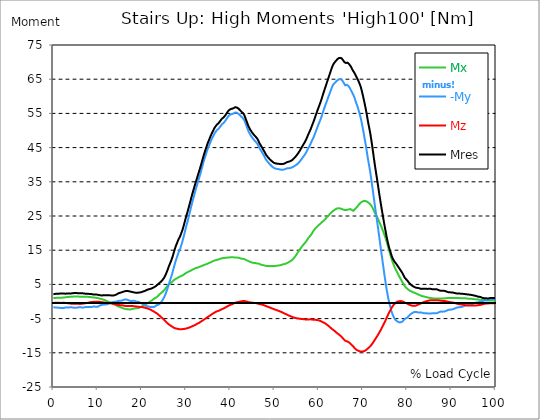
| Category |  Mx |  -My |  Mz |  Mres |
|---|---|---|---|---|
| 0.0 | 1.007 | -1.636 | -0.413 | 2.121 |
| 0.16678370786516855 | 1.007 | -1.672 | -0.413 | 2.175 |
| 0.3335674157303371 | 1.025 | -1.726 | -0.395 | 2.211 |
| 0.5003511235955057 | 1.043 | -1.744 | -0.378 | 2.247 |
| 0.6671348314606742 | 1.061 | -1.78 | -0.378 | 2.265 |
| 0.8339185393258427 | 1.079 | -1.798 | -0.378 | 2.283 |
| 1.0007022471910114 | 1.097 | -1.798 | -0.378 | 2.283 |
| 1.1674859550561796 | 1.115 | -1.798 | -0.395 | 2.301 |
| 1.3342696629213484 | 1.115 | -1.834 | -0.395 | 2.301 |
| 1.5010533707865168 | 1.115 | -1.87 | -0.413 | 2.337 |
| 1.6678370786516854 | 1.115 | -1.888 | -0.413 | 2.355 |
| 1.8346207865168538 | 1.115 | -1.923 | -0.413 | 2.373 |
| 2.001404494382023 | 1.133 | -1.923 | -0.395 | 2.373 |
| 2.1681882022471908 | 1.133 | -1.923 | -0.378 | 2.373 |
| 2.334971910112359 | 1.15 | -1.905 | -0.378 | 2.355 |
| 2.501755617977528 | 1.186 | -1.852 | -0.395 | 2.319 |
| 2.668539325842697 | 1.222 | -1.78 | -0.413 | 2.283 |
| 2.8353230337078656 | 1.24 | -1.744 | -0.449 | 2.283 |
| 3.0021067415730336 | 1.276 | -1.78 | -0.467 | 2.319 |
| 3.168890449438202 | 1.294 | -1.798 | -0.485 | 2.355 |
| 3.335674157303371 | 1.312 | -1.78 | -0.503 | 2.355 |
| 3.502457865168539 | 1.348 | -1.744 | -0.521 | 2.355 |
| 3.6692415730337076 | 1.366 | -1.726 | -0.557 | 2.355 |
| 3.8360252808988764 | 1.384 | -1.69 | -0.593 | 2.337 |
| 4.002808988764046 | 1.402 | -1.672 | -0.629 | 2.355 |
| 4.169592696629214 | 1.42 | -1.69 | -0.647 | 2.373 |
| 4.3363764044943816 | 1.42 | -1.744 | -0.647 | 2.409 |
| 4.50316011235955 | 1.438 | -1.798 | -0.647 | 2.445 |
| 4.669943820224718 | 1.438 | -1.834 | -0.647 | 2.463 |
| 4.836727528089888 | 1.42 | -1.852 | -0.647 | 2.481 |
| 5.003511235955056 | 1.438 | -1.852 | -0.629 | 2.481 |
| 5.170294943820225 | 1.456 | -1.834 | -0.629 | 2.481 |
| 5.337078651685394 | 1.456 | -1.798 | -0.647 | 2.463 |
| 5.5038623595505625 | 1.456 | -1.744 | -0.665 | 2.427 |
| 5.670646067415731 | 1.438 | -1.69 | -0.683 | 2.409 |
| 5.837429775280899 | 1.42 | -1.672 | -0.701 | 2.391 |
| 6.004213483146067 | 1.402 | -1.672 | -0.701 | 2.391 |
| 6.170997191011236 | 1.402 | -1.708 | -0.701 | 2.409 |
| 6.329002808988764 | 1.384 | -1.726 | -0.683 | 2.409 |
| 6.495786516853932 | 1.384 | -1.744 | -0.665 | 2.409 |
| 6.662570224719101 | 1.384 | -1.744 | -0.629 | 2.391 |
| 6.82935393258427 | 1.366 | -1.726 | -0.593 | 2.373 |
| 6.9961376404494375 | 1.366 | -1.708 | -0.557 | 2.337 |
| 7.162921348314607 | 1.366 | -1.654 | -0.521 | 2.301 |
| 7.329705056179775 | 1.384 | -1.618 | -0.503 | 2.265 |
| 7.496488764044945 | 1.384 | -1.6 | -0.467 | 2.265 |
| 7.663272471910113 | 1.384 | -1.618 | -0.413 | 2.265 |
| 7.830056179775281 | 1.366 | -1.618 | -0.378 | 2.247 |
| 7.996839887640449 | 1.33 | -1.618 | -0.324 | 2.229 |
| 8.16362359550562 | 1.312 | -1.618 | -0.252 | 2.193 |
| 8.330407303370787 | 1.294 | -1.636 | -0.198 | 2.175 |
| 8.497191011235955 | 1.276 | -1.636 | -0.162 | 2.175 |
| 8.663974719101123 | 1.24 | -1.618 | -0.126 | 2.157 |
| 8.830758426966291 | 1.222 | -1.528 | -0.126 | 2.121 |
| 8.99754213483146 | 1.186 | -1.492 | -0.108 | 2.067 |
| 9.16432584269663 | 1.168 | -1.474 | -0.108 | 2.049 |
| 9.331109550561798 | 1.15 | -1.492 | -0.108 | 2.049 |
| 9.497893258426966 | 1.115 | -1.528 | -0.108 | 2.049 |
| 9.664676966292134 | 1.061 | -1.528 | -0.09 | 2.031 |
| 9.831460674157304 | 1.025 | -1.528 | -0.09 | 2.031 |
| 9.998244382022472 | 0.989 | -1.51 | -0.072 | 1.995 |
| 10.16502808988764 | 0.935 | -1.402 | -0.072 | 1.941 |
| 10.331811797752808 | 0.899 | -1.294 | -0.09 | 1.888 |
| 10.498595505617978 | 0.845 | -1.186 | -0.108 | 1.852 |
| 10.665379213483147 | 0.791 | -1.097 | -0.126 | 1.816 |
| 10.832162921348315 | 0.719 | -1.025 | -0.162 | 1.78 |
| 10.998946629213483 | 0.665 | -0.971 | -0.198 | 1.762 |
| 11.165730337078653 | 0.593 | -0.917 | -0.234 | 1.798 |
| 11.33251404494382 | 0.521 | -0.899 | -0.27 | 1.834 |
| 11.49929775280899 | 0.431 | -0.881 | -0.306 | 1.852 |
| 11.666081460674157 | 0.378 | -0.863 | -0.342 | 1.816 |
| 11.832865168539326 | 0.27 | -0.863 | -0.36 | 1.816 |
| 11.999648876404493 | 0.18 | -0.845 | -0.395 | 1.834 |
| 12.166432584269662 | 0.072 | -0.809 | -0.413 | 1.834 |
| 12.333216292134832 | -0.018 | -0.737 | -0.431 | 1.816 |
| 12.5 | -0.09 | -0.629 | -0.449 | 1.798 |
| 12.66678370786517 | -0.18 | -0.521 | -0.467 | 1.816 |
| 12.833567415730336 | -0.252 | -0.395 | -0.503 | 1.834 |
| 13.000351123595506 | -0.342 | -0.306 | -0.557 | 1.78 |
| 13.167134831460674 | -0.395 | -0.252 | -0.593 | 1.744 |
| 13.333918539325843 | -0.503 | -0.198 | -0.629 | 1.762 |
| 13.500702247191011 | -0.611 | -0.18 | -0.665 | 1.762 |
| 13.667485955056181 | -0.737 | -0.126 | -0.719 | 1.78 |
| 13.834269662921349 | -0.863 | -0.09 | -0.773 | 1.798 |
| 14.001053370786519 | -0.971 | -0.09 | -0.827 | 1.888 |
| 14.167837078651687 | -1.097 | -0.054 | -0.863 | 1.995 |
| 14.334620786516853 | -1.204 | -0.018 | -0.917 | 2.103 |
| 14.501404494382026 | -1.312 | 0.054 | -0.953 | 2.229 |
| 14.668188202247192 | -1.42 | 0.162 | -1.007 | 2.373 |
| 14.834971910112362 | -1.492 | 0.198 | -1.043 | 2.445 |
| 15.001755617977528 | -1.582 | 0.198 | -1.061 | 2.517 |
| 15.168539325842698 | -1.654 | 0.216 | -1.079 | 2.571 |
| 15.335323033707864 | -1.762 | 0.234 | -1.079 | 2.643 |
| 15.502106741573034 | -1.852 | 0.288 | -1.097 | 2.714 |
| 15.6688904494382 | -1.923 | 0.36 | -1.133 | 2.786 |
| 15.83567415730337 | -2.013 | 0.467 | -1.186 | 2.876 |
| 16.00245786516854 | -2.085 | 0.539 | -1.222 | 2.948 |
| 16.16924157303371 | -2.139 | 0.593 | -1.258 | 3.02 |
| 16.336025280898877 | -2.175 | 0.593 | -1.294 | 3.056 |
| 16.502808988764045 | -2.247 | 0.593 | -1.312 | 3.11 |
| 16.669592696629216 | -2.283 | 0.539 | -1.33 | 3.11 |
| 16.83637640449438 | -2.301 | 0.449 | -1.348 | 3.074 |
| 17.003160112359552 | -2.301 | 0.36 | -1.348 | 3.02 |
| 17.169943820224717 | -2.301 | 0.27 | -1.348 | 2.966 |
| 17.336727528089888 | -2.319 | 0.198 | -1.348 | 2.93 |
| 17.503511235955056 | -2.301 | 0.198 | -1.348 | 2.894 |
| 17.670294943820224 | -2.247 | 0.126 | -1.33 | 2.822 |
| 17.837078651685395 | -2.193 | 0.162 | -1.33 | 2.768 |
| 18.003862359550563 | -2.121 | 0.198 | -1.348 | 2.714 |
| 18.17064606741573 | -2.085 | 0.216 | -1.366 | 2.66 |
| 18.3374297752809 | -2.049 | 0.18 | -1.384 | 2.625 |
| 18.504213483146067 | -1.995 | 0.108 | -1.42 | 2.571 |
| 18.662219101123597 | -1.977 | 0.018 | -1.456 | 2.571 |
| 18.829002808988765 | -1.959 | -0.036 | -1.492 | 2.571 |
| 18.995786516853933 | -1.923 | -0.09 | -1.51 | 2.571 |
| 19.1625702247191 | -1.923 | -0.072 | -1.546 | 2.607 |
| 19.32935393258427 | -1.87 | -0.108 | -1.564 | 2.607 |
| 19.49613764044944 | -1.762 | -0.234 | -1.564 | 2.607 |
| 19.662921348314608 | -1.672 | -0.378 | -1.582 | 2.66 |
| 19.829705056179776 | -1.564 | -0.449 | -1.618 | 2.714 |
| 19.996488764044944 | -1.456 | -0.575 | -1.636 | 2.786 |
| 20.163272471910112 | -1.348 | -0.701 | -1.672 | 2.876 |
| 20.33005617977528 | -1.222 | -0.827 | -1.708 | 2.948 |
| 20.49683988764045 | -1.079 | -0.971 | -1.762 | 3.002 |
| 20.663623595505616 | -0.917 | -1.133 | -1.816 | 3.074 |
| 20.830407303370787 | -0.773 | -1.204 | -1.87 | 3.164 |
| 20.997191011235955 | -0.683 | -1.294 | -1.923 | 3.29 |
| 21.163974719101123 | -0.575 | -1.366 | -1.977 | 3.398 |
| 21.330758426966295 | -0.467 | -1.438 | -2.049 | 3.505 |
| 21.497542134831463 | -0.324 | -1.492 | -2.121 | 3.559 |
| 21.66432584269663 | -0.198 | -1.51 | -2.211 | 3.595 |
| 21.8311095505618 | -0.072 | -1.528 | -2.301 | 3.631 |
| 21.997893258426966 | 0.108 | -1.618 | -2.409 | 3.703 |
| 22.164676966292134 | 0.234 | -1.582 | -2.517 | 3.775 |
| 22.331460674157306 | 0.36 | -1.564 | -2.643 | 3.883 |
| 22.498244382022467 | 0.557 | -1.618 | -2.75 | 4.009 |
| 22.66502808988764 | 0.737 | -1.654 | -2.894 | 4.117 |
| 22.831811797752806 | 0.863 | -1.582 | -3.038 | 4.224 |
| 22.99859550561798 | 0.989 | -1.438 | -3.164 | 4.35 |
| 23.165379213483146 | 1.097 | -1.258 | -3.29 | 4.476 |
| 23.332162921348313 | 1.24 | -1.079 | -3.415 | 4.674 |
| 23.49894662921348 | 1.42 | -0.989 | -3.577 | 4.872 |
| 23.665730337078653 | 1.636 | -0.971 | -3.757 | 5.069 |
| 23.83251404494382 | 1.87 | -0.917 | -3.937 | 5.267 |
| 23.999297752808985 | 2.085 | -0.737 | -4.135 | 5.429 |
| 24.166081460674157 | 2.265 | -0.503 | -4.332 | 5.609 |
| 24.332865168539325 | 2.445 | -0.252 | -4.53 | 5.806 |
| 24.499648876404496 | 2.607 | 0.036 | -4.71 | 6.022 |
| 24.666432584269664 | 2.804 | 0.36 | -4.908 | 6.274 |
| 24.833216292134832 | 3.002 | 0.737 | -5.123 | 6.561 |
| 25.0 | 3.218 | 1.115 | -5.321 | 6.867 |
| 25.16678370786517 | 3.451 | 1.564 | -5.537 | 7.226 |
| 25.33356741573034 | 3.739 | 2.085 | -5.752 | 7.694 |
| 25.500351123595504 | 4.045 | 2.66 | -5.968 | 8.179 |
| 25.66713483146067 | 4.35 | 3.272 | -6.202 | 8.718 |
| 25.833918539325843 | 4.602 | 3.883 | -6.382 | 9.258 |
| 26.00070224719101 | 4.89 | 4.602 | -6.579 | 9.887 |
| 26.16748595505618 | 5.123 | 5.267 | -6.741 | 10.444 |
| 26.334269662921347 | 5.267 | 5.968 | -6.903 | 10.983 |
| 26.50105337078652 | 5.375 | 6.615 | -7.047 | 11.487 |
| 26.667837078651687 | 5.519 | 7.262 | -7.191 | 12.026 |
| 26.834620786516858 | 5.716 | 7.999 | -7.334 | 12.637 |
| 27.001404494382022 | 5.914 | 8.772 | -7.478 | 13.302 |
| 27.16818820224719 | 6.13 | 9.581 | -7.622 | 14.057 |
| 27.334971910112362 | 6.328 | 10.39 | -7.73 | 14.776 |
| 27.50175561797753 | 6.471 | 11.181 | -7.82 | 15.478 |
| 27.668539325842698 | 6.615 | 11.9 | -7.874 | 16.125 |
| 27.835323033707866 | 6.741 | 12.529 | -7.928 | 16.682 |
| 28.002106741573037 | 6.849 | 13.159 | -7.963 | 17.203 |
| 28.168890449438205 | 6.975 | 13.824 | -8.017 | 17.779 |
| 28.335674157303373 | 7.101 | 14.417 | -8.071 | 18.282 |
| 28.502457865168537 | 7.191 | 14.902 | -8.107 | 18.677 |
| 28.669241573033705 | 7.316 | 15.406 | -8.143 | 19.109 |
| 28.836025280898877 | 7.424 | 16.035 | -8.161 | 19.648 |
| 29.002808988764052 | 7.514 | 16.772 | -8.125 | 20.241 |
| 29.169592696629213 | 7.586 | 17.491 | -8.089 | 20.817 |
| 29.336376404494384 | 7.712 | 18.318 | -8.035 | 21.554 |
| 29.50316011235955 | 7.856 | 19.163 | -7.999 | 22.309 |
| 29.669943820224724 | 8.035 | 20.026 | -7.999 | 23.117 |
| 29.836727528089884 | 8.197 | 20.906 | -7.946 | 23.944 |
| 30.003511235955056 | 8.323 | 21.769 | -7.91 | 24.735 |
| 30.170294943820224 | 8.449 | 22.596 | -7.874 | 25.49 |
| 30.337078651685395 | 8.575 | 23.387 | -7.784 | 26.209 |
| 30.503862359550563 | 8.701 | 24.232 | -7.712 | 27 |
| 30.670646067415728 | 8.79 | 25.113 | -7.64 | 27.791 |
| 30.837429775280903 | 8.88 | 25.994 | -7.55 | 28.6 |
| 30.99543539325843 | 8.988 | 26.857 | -7.46 | 29.409 |
| 31.162219101123597 | 9.114 | 27.737 | -7.388 | 30.236 |
| 31.32900280898876 | 9.222 | 28.6 | -7.298 | 31.045 |
| 31.495786516853936 | 9.33 | 29.463 | -7.208 | 31.818 |
| 31.6625702247191 | 9.456 | 30.254 | -7.083 | 32.573 |
| 31.82935393258427 | 9.581 | 31.027 | -6.975 | 33.31 |
| 31.996137640449433 | 9.671 | 31.818 | -6.885 | 34.047 |
| 32.162921348314605 | 9.743 | 32.627 | -6.759 | 34.802 |
| 32.329705056179776 | 9.797 | 33.382 | -6.651 | 35.503 |
| 32.49648876404494 | 9.851 | 34.101 | -6.543 | 36.15 |
| 32.66327247191011 | 9.941 | 34.91 | -6.418 | 36.905 |
| 32.83005617977528 | 10.049 | 35.593 | -6.328 | 37.57 |
| 32.996839887640455 | 10.121 | 36.294 | -6.202 | 38.253 |
| 33.16362359550562 | 10.193 | 37.031 | -6.058 | 38.955 |
| 33.330407303370784 | 10.282 | 37.822 | -5.896 | 39.71 |
| 33.497191011235955 | 10.372 | 38.577 | -5.752 | 40.429 |
| 33.66397471910113 | 10.462 | 39.386 | -5.627 | 41.202 |
| 33.83075842696629 | 10.552 | 40.231 | -5.483 | 42.011 |
| 33.997542134831455 | 10.642 | 41.004 | -5.339 | 42.748 |
| 34.164325842696634 | 10.732 | 41.705 | -5.195 | 43.431 |
| 34.3311095505618 | 10.804 | 42.388 | -5.051 | 44.096 |
| 34.49789325842697 | 10.894 | 43.035 | -4.89 | 44.725 |
| 34.66467696629213 | 10.966 | 43.718 | -4.746 | 45.39 |
| 34.831460674157306 | 11.055 | 44.383 | -4.602 | 46.037 |
| 34.99824438202247 | 11.145 | 44.977 | -4.458 | 46.63 |
| 35.16502808988764 | 11.253 | 45.498 | -4.314 | 47.134 |
| 35.331811797752806 | 11.343 | 46.037 | -4.17 | 47.673 |
| 35.49859550561798 | 11.415 | 46.576 | -4.027 | 48.194 |
| 35.66537921348315 | 11.505 | 47.062 | -3.883 | 48.698 |
| 35.83216292134831 | 11.631 | 47.565 | -3.739 | 49.183 |
| 35.998946629213485 | 11.738 | 48.015 | -3.595 | 49.632 |
| 36.16573033707865 | 11.846 | 48.428 | -3.469 | 50.064 |
| 36.33251404494382 | 11.936 | 48.877 | -3.326 | 50.513 |
| 36.499297752808985 | 12.008 | 49.255 | -3.2 | 50.873 |
| 36.666081460674164 | 12.08 | 49.561 | -3.056 | 51.178 |
| 36.83286516853932 | 12.134 | 49.848 | -2.948 | 51.466 |
| 36.99964887640449 | 12.188 | 50.136 | -2.876 | 51.772 |
| 37.166432584269664 | 12.242 | 50.316 | -2.804 | 51.951 |
| 37.333216292134836 | 12.296 | 50.477 | -2.732 | 52.113 |
| 37.5 | 12.386 | 50.675 | -2.643 | 52.329 |
| 37.666783707865164 | 12.476 | 51.017 | -2.517 | 52.67 |
| 37.833567415730336 | 12.547 | 51.322 | -2.409 | 52.976 |
| 38.00035112359551 | 12.601 | 51.538 | -2.319 | 53.174 |
| 38.16713483146068 | 12.637 | 51.879 | -2.211 | 53.515 |
| 38.333918539325836 | 12.673 | 52.059 | -2.121 | 53.695 |
| 38.50070224719101 | 12.709 | 52.221 | -2.031 | 53.839 |
| 38.66748595505618 | 12.727 | 52.419 | -1.923 | 54.037 |
| 38.83426966292135 | 12.763 | 52.742 | -1.798 | 54.36 |
| 39.001053370786515 | 12.799 | 53.048 | -1.672 | 54.666 |
| 39.16783707865169 | 12.817 | 53.407 | -1.546 | 55.007 |
| 39.33462078651686 | 12.835 | 53.713 | -1.42 | 55.313 |
| 39.50140449438202 | 12.871 | 54.073 | -1.312 | 55.654 |
| 39.668188202247194 | 12.889 | 54.324 | -1.186 | 55.888 |
| 39.83497191011236 | 12.889 | 54.522 | -1.079 | 56.086 |
| 40.00175561797753 | 12.907 | 54.648 | -0.989 | 56.212 |
| 40.168539325842694 | 12.925 | 54.738 | -0.899 | 56.302 |
| 40.335323033707866 | 12.907 | 54.774 | -0.827 | 56.338 |
| 40.50210674157304 | 12.907 | 54.846 | -0.737 | 56.392 |
| 40.6688904494382 | 12.907 | 54.953 | -0.629 | 56.499 |
| 40.83567415730337 | 12.889 | 55.043 | -0.539 | 56.589 |
| 41.00245786516854 | 12.889 | 55.187 | -0.431 | 56.715 |
| 41.16924157303371 | 12.871 | 55.277 | -0.342 | 56.823 |
| 41.33602528089887 | 12.853 | 55.241 | -0.288 | 56.787 |
| 41.502808988764045 | 12.835 | 55.169 | -0.234 | 56.697 |
| 41.669592696629216 | 12.817 | 55.043 | -0.18 | 56.571 |
| 41.83637640449439 | 12.781 | 54.899 | -0.144 | 56.427 |
| 42.00316011235955 | 12.763 | 54.756 | -0.09 | 56.284 |
| 42.16994382022472 | 12.673 | 54.486 | -0.036 | 55.996 |
| 42.33672752808989 | 12.601 | 54.27 | 0.018 | 55.762 |
| 42.50351123595506 | 12.547 | 54.037 | 0.054 | 55.529 |
| 42.670294943820224 | 12.476 | 53.821 | 0.09 | 55.295 |
| 42.83707865168539 | 12.476 | 53.659 | 0.126 | 55.133 |
| 43.00386235955057 | 12.458 | 53.443 | 0.144 | 54.935 |
| 43.17064606741573 | 12.404 | 53.03 | 0.126 | 54.504 |
| 43.32865168539326 | 12.296 | 52.491 | 0.108 | 53.965 |
| 43.495435393258425 | 12.188 | 51.915 | 0.054 | 53.371 |
| 43.6622191011236 | 12.08 | 51.322 | 0 | 52.796 |
| 43.82900280898876 | 11.972 | 50.729 | -0.054 | 52.203 |
| 43.99578651685393 | 11.864 | 50.154 | -0.126 | 51.628 |
| 44.162570224719104 | 11.774 | 49.614 | -0.198 | 51.089 |
| 44.32935393258427 | 11.685 | 49.219 | -0.252 | 50.693 |
| 44.49613764044944 | 11.595 | 48.824 | -0.288 | 50.28 |
| 44.66292134831461 | 11.505 | 48.5 | -0.306 | 49.956 |
| 44.82970505617978 | 11.415 | 48.158 | -0.342 | 49.596 |
| 44.99648876404493 | 11.361 | 47.853 | -0.36 | 49.291 |
| 45.16327247191011 | 11.325 | 47.547 | -0.378 | 49.003 |
| 45.33005617977528 | 11.289 | 47.296 | -0.395 | 48.752 |
| 45.49683988764045 | 11.253 | 47.062 | -0.413 | 48.518 |
| 45.66362359550561 | 11.235 | 46.846 | -0.449 | 48.284 |
| 45.83040730337079 | 11.199 | 46.594 | -0.485 | 48.033 |
| 45.99719101123596 | 11.145 | 46.343 | -0.503 | 47.799 |
| 46.16397471910113 | 11.145 | 46.037 | -0.557 | 47.493 |
| 46.33075842696629 | 11.091 | 45.588 | -0.647 | 47.044 |
| 46.497542134831455 | 10.983 | 45.138 | -0.701 | 46.576 |
| 46.66432584269663 | 10.93 | 44.689 | -0.773 | 46.145 |
| 46.83110955056179 | 10.84 | 44.365 | -0.809 | 45.786 |
| 46.99789325842696 | 10.75 | 44.006 | -0.845 | 45.426 |
| 47.164676966292134 | 10.678 | 43.664 | -0.899 | 45.066 |
| 47.331460674157306 | 10.642 | 43.269 | -0.971 | 44.689 |
| 47.49824438202247 | 10.606 | 42.873 | -1.043 | 44.293 |
| 47.66502808988764 | 10.552 | 42.514 | -1.115 | 43.934 |
| 47.83181179775281 | 10.516 | 42.118 | -1.204 | 43.538 |
| 47.99859550561797 | 10.462 | 41.669 | -1.312 | 43.089 |
| 48.16537921348314 | 10.39 | 41.327 | -1.384 | 42.766 |
| 48.33216292134831 | 10.336 | 41.076 | -1.438 | 42.496 |
| 48.498946629213485 | 10.354 | 40.77 | -1.528 | 42.208 |
| 48.66573033707865 | 10.39 | 40.5 | -1.636 | 41.957 |
| 48.83251404494382 | 10.372 | 40.267 | -1.708 | 41.723 |
| 48.99929775280899 | 10.336 | 40.033 | -1.78 | 41.489 |
| 49.166081460674164 | 10.336 | 39.853 | -1.87 | 41.309 |
| 49.33286516853933 | 10.354 | 39.62 | -1.959 | 41.094 |
| 49.499648876404486 | 10.354 | 39.422 | -2.049 | 40.914 |
| 49.666432584269664 | 10.354 | 39.242 | -2.121 | 40.734 |
| 49.83321629213483 | 10.336 | 39.08 | -2.211 | 40.572 |
| 50.0 | 10.372 | 38.937 | -2.301 | 40.447 |
| 50.166783707865164 | 10.408 | 38.883 | -2.373 | 40.393 |
| 50.33356741573034 | 10.444 | 38.829 | -2.463 | 40.357 |
| 50.50035112359551 | 10.48 | 38.775 | -2.535 | 40.321 |
| 50.66713483146068 | 10.48 | 38.739 | -2.607 | 40.303 |
| 50.83391853932584 | 10.516 | 38.703 | -2.678 | 40.267 |
| 51.00070224719101 | 10.534 | 38.667 | -2.768 | 40.231 |
| 51.16748595505618 | 10.57 | 38.631 | -2.858 | 40.231 |
| 51.33426966292134 | 10.624 | 38.595 | -2.948 | 40.213 |
| 51.50105337078652 | 10.678 | 38.523 | -3.038 | 40.159 |
| 51.66783707865169 | 10.75 | 38.469 | -3.128 | 40.141 |
| 51.83462078651686 | 10.822 | 38.505 | -3.236 | 40.195 |
| 52.00140449438202 | 10.894 | 38.559 | -3.326 | 40.267 |
| 52.168188202247194 | 10.93 | 38.595 | -3.451 | 40.303 |
| 52.33497191011236 | 10.966 | 38.649 | -3.559 | 40.375 |
| 52.50175561797752 | 11.055 | 38.757 | -3.649 | 40.5 |
| 52.668539325842694 | 11.145 | 38.865 | -3.739 | 40.644 |
| 52.835323033707866 | 11.235 | 38.937 | -3.829 | 40.752 |
| 53.00210674157304 | 11.343 | 38.955 | -3.937 | 40.806 |
| 53.1688904494382 | 11.451 | 38.973 | -4.045 | 40.86 |
| 53.33567415730337 | 11.595 | 38.937 | -4.153 | 40.896 |
| 53.502457865168545 | 11.703 | 39.008 | -4.242 | 41.004 |
| 53.669241573033716 | 11.828 | 39.062 | -4.332 | 41.094 |
| 53.83602528089887 | 11.954 | 39.134 | -4.422 | 41.22 |
| 54.002808988764045 | 12.134 | 39.206 | -4.512 | 41.363 |
| 54.169592696629216 | 12.332 | 39.332 | -4.602 | 41.543 |
| 54.33637640449438 | 12.619 | 39.476 | -4.674 | 41.777 |
| 54.50316011235955 | 12.871 | 39.602 | -4.746 | 42.011 |
| 54.669943820224724 | 13.159 | 39.745 | -4.8 | 42.226 |
| 54.836727528089895 | 13.464 | 39.871 | -4.854 | 42.46 |
| 55.00351123595506 | 13.788 | 39.997 | -4.89 | 42.712 |
| 55.17029494382022 | 14.147 | 40.195 | -4.925 | 43.017 |
| 55.337078651685395 | 14.507 | 40.393 | -4.961 | 43.341 |
| 55.50386235955056 | 14.794 | 40.608 | -4.997 | 43.646 |
| 55.66186797752809 | 15.118 | 40.842 | -5.033 | 43.988 |
| 55.82865168539326 | 15.406 | 41.13 | -5.069 | 44.347 |
| 55.995435393258425 | 15.693 | 41.435 | -5.087 | 44.725 |
| 56.1622191011236 | 15.999 | 41.723 | -5.123 | 45.102 |
| 56.32900280898877 | 16.286 | 42.028 | -5.141 | 45.48 |
| 56.49578651685393 | 16.556 | 42.316 | -5.159 | 45.857 |
| 56.6625702247191 | 16.808 | 42.604 | -5.177 | 46.199 |
| 56.82935393258427 | 17.041 | 42.891 | -5.213 | 46.541 |
| 56.99613764044943 | 17.275 | 43.233 | -5.249 | 46.954 |
| 57.16292134831461 | 17.581 | 43.592 | -5.267 | 47.403 |
| 57.329705056179776 | 17.922 | 44.006 | -5.267 | 47.889 |
| 57.49648876404495 | 18.228 | 44.437 | -5.267 | 48.41 |
| 57.66327247191011 | 18.623 | 44.869 | -5.267 | 48.949 |
| 57.83005617977529 | 18.875 | 45.264 | -5.249 | 49.399 |
| 57.99683988764044 | 19.073 | 45.696 | -5.213 | 49.866 |
| 58.16362359550561 | 19.306 | 46.145 | -5.213 | 50.369 |
| 58.33040730337079 | 19.612 | 46.63 | -5.231 | 50.927 |
| 58.497191011235955 | 19.936 | 47.134 | -5.249 | 51.52 |
| 58.66397471910112 | 20.331 | 47.547 | -5.303 | 52.041 |
| 58.83075842696629 | 20.709 | 47.997 | -5.357 | 52.599 |
| 58.99754213483147 | 20.978 | 48.554 | -5.357 | 53.21 |
| 59.164325842696634 | 21.266 | 49.111 | -5.357 | 53.839 |
| 59.33110955056179 | 21.5 | 49.686 | -5.357 | 54.468 |
| 59.49789325842697 | 21.733 | 50.262 | -5.375 | 55.079 |
| 59.664676966292134 | 21.967 | 50.801 | -5.429 | 55.69 |
| 59.8314606741573 | 22.165 | 51.376 | -5.483 | 56.302 |
| 59.99824438202247 | 22.327 | 51.933 | -5.519 | 56.859 |
| 60.16502808988765 | 22.524 | 52.455 | -5.591 | 57.434 |
| 60.33181179775281 | 22.74 | 53.012 | -5.663 | 58.027 |
| 60.49859550561798 | 22.92 | 53.569 | -5.752 | 58.621 |
| 60.66537921348315 | 23.099 | 54.198 | -5.86 | 59.286 |
| 60.83216292134831 | 23.315 | 54.881 | -5.968 | 60.005 |
| 60.99894662921348 | 23.513 | 55.547 | -6.076 | 60.688 |
| 61.16573033707864 | 23.675 | 56.158 | -6.166 | 61.335 |
| 61.33251404494383 | 23.89 | 56.787 | -6.292 | 62 |
| 61.49929775280899 | 24.106 | 57.434 | -6.435 | 62.683 |
| 61.66608146067416 | 24.376 | 57.991 | -6.597 | 63.312 |
| 61.83286516853932 | 24.645 | 58.567 | -6.759 | 63.96 |
| 61.99964887640451 | 24.861 | 59.196 | -6.921 | 64.625 |
| 62.16643258426967 | 25.041 | 59.789 | -7.065 | 65.254 |
| 62.33321629213482 | 25.311 | 60.346 | -7.262 | 65.901 |
| 62.5 | 25.598 | 60.922 | -7.46 | 66.548 |
| 62.66678370786517 | 25.814 | 61.533 | -7.658 | 67.213 |
| 62.833567415730336 | 26.03 | 62.09 | -7.856 | 67.824 |
| 63.0003511235955 | 26.209 | 62.665 | -8.035 | 68.454 |
| 63.16713483146068 | 26.371 | 63.151 | -8.179 | 68.975 |
| 63.33391853932585 | 26.533 | 63.546 | -8.341 | 69.424 |
| 63.500702247191015 | 26.713 | 63.798 | -8.521 | 69.748 |
| 63.66748595505618 | 26.874 | 63.942 | -8.701 | 69.964 |
| 63.83426966292135 | 27 | 64.211 | -8.898 | 70.287 |
| 64.00105337078651 | 27.126 | 64.427 | -9.078 | 70.557 |
| 64.16783707865169 | 27.216 | 64.607 | -9.24 | 70.773 |
| 64.33462078651687 | 27.252 | 64.786 | -9.42 | 70.988 |
| 64.50140449438203 | 27.252 | 64.948 | -9.581 | 71.15 |
| 64.6681882022472 | 27.252 | 64.984 | -9.761 | 71.222 |
| 64.83497191011236 | 27.216 | 64.984 | -9.959 | 71.24 |
| 65.00175561797754 | 27.18 | 65.002 | -10.121 | 71.258 |
| 65.16853932584269 | 27.072 | 64.858 | -10.336 | 71.114 |
| 65.33532303370787 | 26.964 | 64.607 | -10.57 | 70.88 |
| 65.50210674157304 | 26.892 | 64.247 | -10.822 | 70.575 |
| 65.66889044943821 | 26.785 | 63.906 | -11.055 | 70.251 |
| 65.83567415730337 | 26.749 | 63.546 | -11.271 | 69.946 |
| 66.00245786516854 | 26.713 | 63.222 | -11.469 | 69.676 |
| 66.1692415730337 | 26.749 | 63.276 | -11.559 | 69.748 |
| 66.33602528089888 | 26.803 | 63.366 | -11.631 | 69.856 |
| 66.50280898876404 | 26.839 | 63.294 | -11.721 | 69.838 |
| 66.66959269662921 | 26.892 | 63.097 | -11.828 | 69.676 |
| 66.83637640449439 | 26.928 | 62.827 | -11.936 | 69.46 |
| 67.00316011235955 | 26.928 | 62.503 | -12.098 | 69.191 |
| 67.16994382022472 | 27.036 | 62.072 | -12.314 | 68.885 |
| 67.33672752808988 | 27.072 | 61.641 | -12.547 | 68.561 |
| 67.50351123595506 | 26.749 | 61.227 | -12.709 | 68.076 |
| 67.67029494382022 | 26.569 | 60.814 | -12.943 | 67.663 |
| 67.83707865168539 | 26.533 | 60.382 | -13.195 | 67.321 |
| 67.99508426966291 | 26.713 | 59.897 | -13.446 | 66.997 |
| 68.16186797752809 | 26.946 | 59.268 | -13.716 | 66.602 |
| 68.32865168539327 | 27.198 | 58.603 | -13.932 | 66.153 |
| 68.49543539325843 | 27.432 | 57.955 | -14.093 | 65.721 |
| 68.6622191011236 | 27.647 | 57.398 | -14.237 | 65.344 |
| 68.82900280898876 | 27.917 | 56.751 | -14.327 | 64.912 |
| 68.99578651685394 | 28.205 | 55.996 | -14.417 | 64.409 |
| 69.1625702247191 | 28.474 | 55.259 | -14.489 | 63.888 |
| 69.32935393258425 | 28.708 | 54.486 | -14.579 | 63.348 |
| 69.49613764044945 | 28.924 | 53.641 | -14.651 | 62.737 |
| 69.66292134831461 | 29.086 | 52.634 | -14.669 | 61.964 |
| 69.82970505617978 | 29.193 | 51.538 | -14.651 | 61.083 |
| 69.99648876404494 | 29.301 | 50.405 | -14.615 | 60.184 |
| 70.16327247191012 | 29.373 | 49.219 | -14.561 | 59.196 |
| 70.33005617977528 | 29.427 | 47.979 | -14.453 | 58.189 |
| 70.49683988764045 | 29.427 | 46.774 | -14.345 | 57.164 |
| 70.66362359550561 | 29.373 | 45.498 | -14.219 | 56.068 |
| 70.83040730337079 | 29.265 | 44.15 | -14.057 | 54.881 |
| 70.99719101123596 | 29.104 | 42.748 | -13.86 | 53.623 |
| 71.16397471910112 | 28.96 | 41.417 | -13.662 | 52.419 |
| 71.3307584269663 | 28.798 | 40.195 | -13.482 | 51.322 |
| 71.49754213483146 | 28.618 | 38.99 | -13.284 | 50.244 |
| 71.66432584269663 | 28.42 | 37.66 | -13.069 | 49.039 |
| 71.83110955056179 | 28.133 | 36.222 | -12.817 | 47.709 |
| 71.99789325842697 | 27.809 | 34.694 | -12.547 | 46.289 |
| 72.16467696629215 | 27.432 | 33.076 | -12.242 | 44.779 |
| 72.3314606741573 | 26.982 | 31.494 | -11.918 | 43.233 |
| 72.49824438202248 | 26.497 | 29.895 | -11.577 | 41.669 |
| 72.66502808988764 | 26.048 | 28.313 | -11.235 | 40.159 |
| 72.8318117977528 | 25.616 | 26.767 | -10.912 | 38.721 |
| 72.99859550561797 | 25.185 | 25.239 | -10.57 | 37.301 |
| 73.16537921348315 | 24.789 | 23.747 | -10.246 | 35.988 |
| 73.33216292134833 | 24.34 | 22.219 | -9.887 | 34.55 |
| 73.49894662921349 | 23.819 | 20.655 | -9.509 | 33.076 |
| 73.66573033707864 | 23.333 | 19.073 | -9.15 | 31.656 |
| 73.83251404494382 | 22.848 | 17.473 | -8.772 | 30.272 |
| 73.99929775280899 | 22.362 | 15.855 | -8.395 | 28.906 |
| 74.16608146067415 | 21.859 | 14.273 | -7.999 | 27.576 |
| 74.33286516853933 | 21.302 | 12.691 | -7.532 | 26.335 |
| 74.49964887640449 | 20.727 | 11.127 | -7.101 | 25.077 |
| 74.66643258426967 | 20.169 | 9.599 | -6.687 | 23.819 |
| 74.83321629213484 | 19.594 | 8.017 | -6.274 | 22.542 |
| 75.0 | 18.947 | 6.597 | -5.806 | 21.41 |
| 75.16678370786516 | 18.282 | 5.141 | -5.339 | 20.223 |
| 75.33356741573033 | 17.581 | 3.703 | -4.836 | 19.019 |
| 75.5003511235955 | 16.862 | 2.517 | -4.386 | 18.048 |
| 75.66713483146067 | 16.071 | 1.312 | -3.883 | 17.041 |
| 75.83391853932585 | 15.316 | 0.306 | -3.433 | 16.161 |
| 76.00070224719101 | 14.579 | -0.611 | -3.02 | 15.352 |
| 76.16748595505618 | 13.878 | -1.42 | -2.625 | 14.705 |
| 76.33426966292136 | 13.105 | -2.265 | -2.229 | 14.004 |
| 76.50105337078652 | 12.332 | -3.056 | -1.816 | 13.302 |
| 76.66783707865167 | 11.685 | -3.685 | -1.474 | 12.781 |
| 76.83462078651685 | 11.091 | -4.206 | -1.168 | 12.296 |
| 77.00140449438202 | 10.588 | -4.602 | -0.917 | 11.972 |
| 77.1681882022472 | 10.049 | -5.033 | -0.647 | 11.613 |
| 77.33497191011236 | 9.599 | -5.339 | -0.431 | 11.343 |
| 77.50175561797754 | 9.15 | -5.591 | -0.27 | 11.055 |
| 77.6685393258427 | 8.718 | -5.734 | -0.126 | 10.75 |
| 77.83532303370787 | 8.287 | -5.86 | -0.018 | 10.426 |
| 78.00210674157303 | 7.838 | -5.986 | 0.036 | 10.103 |
| 78.1688904494382 | 7.424 | -6.094 | 0.09 | 9.797 |
| 78.33567415730337 | 7.029 | -6.13 | 0.126 | 9.473 |
| 78.50245786516854 | 6.633 | -6.094 | 0.144 | 9.15 |
| 78.66924157303372 | 6.256 | -6.022 | 0.126 | 8.826 |
| 78.83602528089888 | 5.842 | -5.95 | 0.072 | 8.485 |
| 79.00280898876404 | 5.501 | -5.788 | 0.018 | 8.125 |
| 79.16959269662921 | 5.105 | -5.555 | -0.09 | 7.712 |
| 79.33637640449439 | 4.728 | -5.231 | -0.252 | 7.226 |
| 79.50316011235955 | 4.44 | -5.015 | -0.378 | 6.867 |
| 79.66994382022472 | 4.153 | -4.943 | -0.431 | 6.597 |
| 79.8367275280899 | 3.919 | -4.908 | -0.503 | 6.418 |
| 80.00351123595506 | 3.739 | -4.782 | -0.575 | 6.202 |
| 80.17029494382022 | 3.559 | -4.53 | -0.701 | 5.896 |
| 80.32830056179776 | 3.398 | -4.26 | -0.845 | 5.591 |
| 80.49508426966293 | 3.236 | -4.009 | -0.971 | 5.321 |
| 80.66186797752809 | 3.11 | -3.811 | -1.061 | 5.105 |
| 80.82865168539325 | 3.002 | -3.667 | -1.115 | 4.925 |
| 80.99543539325842 | 2.894 | -3.505 | -1.186 | 4.746 |
| 81.1622191011236 | 2.804 | -3.362 | -1.24 | 4.584 |
| 81.32900280898878 | 2.714 | -3.254 | -1.276 | 4.458 |
| 81.49578651685394 | 2.625 | -3.164 | -1.276 | 4.332 |
| 81.6625702247191 | 2.535 | -3.074 | -1.294 | 4.206 |
| 81.82935393258427 | 2.445 | -3.02 | -1.276 | 4.117 |
| 81.99613764044945 | 2.355 | -3.038 | -1.186 | 4.045 |
| 82.16292134831461 | 2.265 | -3.092 | -1.097 | 4.009 |
| 82.32970505617978 | 2.157 | -3.164 | -0.989 | 3.973 |
| 82.49648876404494 | 2.049 | -3.2 | -0.881 | 3.937 |
| 82.66327247191012 | 1.959 | -3.218 | -0.791 | 3.901 |
| 82.83005617977528 | 1.87 | -3.2 | -0.719 | 3.811 |
| 82.99683988764045 | 1.78 | -3.182 | -0.629 | 3.739 |
| 83.16362359550563 | 1.69 | -3.2 | -0.539 | 3.685 |
| 83.33040730337079 | 1.6 | -3.254 | -0.431 | 3.685 |
| 83.49719101123596 | 1.546 | -3.326 | -0.306 | 3.721 |
| 83.66397471910112 | 1.492 | -3.398 | -0.216 | 3.757 |
| 83.8307584269663 | 1.438 | -3.451 | -0.144 | 3.775 |
| 83.99754213483146 | 1.384 | -3.451 | -0.054 | 3.757 |
| 84.16432584269663 | 1.33 | -3.433 | 0.018 | 3.703 |
| 84.33110955056179 | 1.276 | -3.451 | 0.072 | 3.703 |
| 84.49789325842697 | 1.222 | -3.469 | 0.126 | 3.685 |
| 84.66467696629213 | 1.168 | -3.487 | 0.18 | 3.685 |
| 84.8314606741573 | 1.115 | -3.523 | 0.234 | 3.703 |
| 84.99824438202248 | 1.079 | -3.541 | 0.288 | 3.721 |
| 85.16502808988764 | 1.043 | -3.559 | 0.342 | 3.721 |
| 85.3318117977528 | 1.007 | -3.541 | 0.378 | 3.703 |
| 85.49859550561797 | 0.971 | -3.487 | 0.378 | 3.649 |
| 85.66537921348315 | 0.953 | -3.433 | 0.378 | 3.595 |
| 85.83216292134831 | 0.917 | -3.415 | 0.378 | 3.559 |
| 85.99894662921348 | 0.899 | -3.415 | 0.378 | 3.559 |
| 86.16573033707866 | 0.881 | -3.451 | 0.378 | 3.577 |
| 86.33251404494384 | 0.881 | -3.451 | 0.378 | 3.595 |
| 86.499297752809 | 0.899 | -3.469 | 0.395 | 3.613 |
| 86.66608146067415 | 0.899 | -3.433 | 0.395 | 3.577 |
| 86.83286516853933 | 0.881 | -3.344 | 0.378 | 3.487 |
| 86.99964887640449 | 0.881 | -3.254 | 0.36 | 3.398 |
| 87.16643258426966 | 0.881 | -3.164 | 0.324 | 3.308 |
| 87.33321629213482 | 0.899 | -3.056 | 0.288 | 3.218 |
| 87.5 | 0.899 | -3.002 | 0.252 | 3.164 |
| 87.66678370786518 | 0.899 | -2.948 | 0.216 | 3.128 |
| 87.83356741573033 | 0.899 | -2.966 | 0.198 | 3.128 |
| 88.00035112359551 | 0.899 | -2.966 | 0.18 | 3.128 |
| 88.16713483146067 | 0.899 | -2.966 | 0.162 | 3.146 |
| 88.33391853932584 | 0.899 | -2.948 | 0.144 | 3.128 |
| 88.500702247191 | 0.935 | -2.912 | 0.126 | 3.092 |
| 88.66748595505618 | 0.953 | -2.822 | 0.09 | 3.02 |
| 88.83426966292136 | 0.971 | -2.732 | 0.072 | 2.948 |
| 89.00105337078652 | 0.989 | -2.625 | 0.018 | 2.858 |
| 89.16783707865169 | 1.007 | -2.535 | -0.036 | 2.786 |
| 89.33462078651687 | 1.007 | -2.445 | -0.09 | 2.714 |
| 89.50140449438203 | 1.007 | -2.409 | -0.126 | 2.678 |
| 89.6681882022472 | 0.989 | -2.409 | -0.18 | 2.678 |
| 89.83497191011236 | 0.989 | -2.391 | -0.216 | 2.678 |
| 90.00175561797754 | 0.989 | -2.355 | -0.252 | 2.66 |
| 90.16853932584269 | 0.989 | -2.337 | -0.27 | 2.643 |
| 90.33532303370787 | 0.989 | -2.265 | -0.306 | 2.625 |
| 90.50210674157303 | 1.007 | -2.193 | -0.342 | 2.571 |
| 90.6688904494382 | 1.025 | -2.085 | -0.395 | 2.499 |
| 90.83567415730336 | 1.025 | -1.995 | -0.467 | 2.427 |
| 91.00245786516854 | 1.043 | -1.905 | -0.539 | 2.391 |
| 91.1692415730337 | 1.043 | -1.816 | -0.593 | 2.355 |
| 91.33602528089888 | 1.043 | -1.744 | -0.665 | 2.337 |
| 91.50280898876404 | 1.025 | -1.708 | -0.719 | 2.337 |
| 91.66959269662922 | 1.007 | -1.69 | -0.773 | 2.337 |
| 91.83637640449439 | 0.989 | -1.654 | -0.791 | 2.319 |
| 92.00316011235955 | 0.971 | -1.636 | -0.827 | 2.301 |
| 92.16994382022472 | 0.953 | -1.618 | -0.863 | 2.301 |
| 92.3367275280899 | 0.953 | -1.582 | -0.881 | 2.283 |
| 92.50351123595506 | 0.971 | -1.492 | -0.917 | 2.247 |
| 92.66151685393258 | 0.971 | -1.402 | -0.953 | 2.229 |
| 92.82830056179776 | 0.971 | -1.312 | -0.989 | 2.211 |
| 92.99508426966291 | 0.971 | -1.222 | -1.025 | 2.175 |
| 93.16186797752809 | 0.935 | -1.133 | -1.115 | 2.139 |
| 93.32865168539325 | 0.917 | -1.061 | -1.168 | 2.121 |
| 93.49543539325842 | 0.899 | -1.007 | -1.186 | 2.103 |
| 93.66221910112358 | 0.845 | -1.007 | -1.204 | 2.067 |
| 93.82900280898876 | 0.809 | -1.025 | -1.204 | 2.031 |
| 93.99578651685393 | 0.809 | -1.025 | -1.204 | 2.013 |
| 94.1625702247191 | 0.791 | -1.007 | -1.204 | 1.977 |
| 94.32935393258427 | 0.773 | -0.971 | -1.186 | 1.959 |
| 94.49613764044945 | 0.773 | -0.899 | -1.186 | 1.923 |
| 94.66292134831461 | 0.773 | -0.827 | -1.168 | 1.888 |
| 94.82970505617978 | 0.737 | -0.719 | -1.168 | 1.834 |
| 94.99648876404494 | 0.701 | -0.575 | -1.186 | 1.78 |
| 95.16327247191012 | 0.683 | -0.485 | -1.168 | 1.726 |
| 95.33005617977528 | 0.665 | -0.431 | -1.168 | 1.69 |
| 95.49683988764046 | 0.647 | -0.378 | -1.168 | 1.654 |
| 95.66362359550563 | 0.611 | -0.306 | -1.15 | 1.582 |
| 95.83040730337078 | 0.593 | -0.288 | -1.115 | 1.492 |
| 95.99719101123594 | 0.575 | -0.27 | -1.079 | 1.42 |
| 96.16397471910112 | 0.557 | -0.18 | -1.061 | 1.402 |
| 96.33075842696628 | 0.539 | -0.108 | -1.043 | 1.384 |
| 96.49754213483145 | 0.503 | -0.072 | -1.007 | 1.33 |
| 96.66432584269663 | 0.467 | -0.072 | -0.971 | 1.276 |
| 96.8311095505618 | 0.449 | 0 | -0.917 | 1.168 |
| 96.99789325842697 | 0.431 | 0.108 | -0.809 | 1.061 |
| 97.16467696629213 | 0.431 | 0.18 | -0.755 | 1.007 |
| 97.3314606741573 | 0.431 | 0.252 | -0.701 | 0.989 |
| 97.49824438202248 | 0.413 | 0.27 | -0.665 | 0.953 |
| 97.66502808988764 | 0.395 | 0.324 | -0.629 | 0.935 |
| 97.8318117977528 | 0.378 | 0.378 | -0.593 | 0.935 |
| 97.99859550561798 | 0.36 | 0.378 | -0.575 | 0.917 |
| 98.16537921348316 | 0.324 | 0.395 | -0.575 | 0.899 |
| 98.33216292134833 | 0.306 | 0.449 | -0.557 | 0.899 |
| 98.49894662921349 | 0.306 | 0.539 | -0.539 | 0.917 |
| 98.66573033707866 | 0.306 | 0.611 | -0.539 | 0.989 |
| 98.8325140449438 | 0.306 | 0.683 | -0.539 | 1.043 |
| 98.99929775280897 | 0.306 | 0.737 | -0.539 | 1.061 |
| 99.16608146067416 | 0.306 | 0.719 | -0.539 | 1.043 |
| 99.33286516853933 | 0.306 | 0.719 | -0.539 | 1.043 |
| 99.49964887640449 | 0.288 | 0.701 | -0.539 | 1.025 |
| 99.66643258426966 | 0.27 | 0.701 | -0.539 | 1.007 |
| 99.83321629213484 | 0.27 | 0.629 | -0.521 | 0.971 |
| 100.0 | 0.27 | 0.575 | -0.503 | 0.899 |